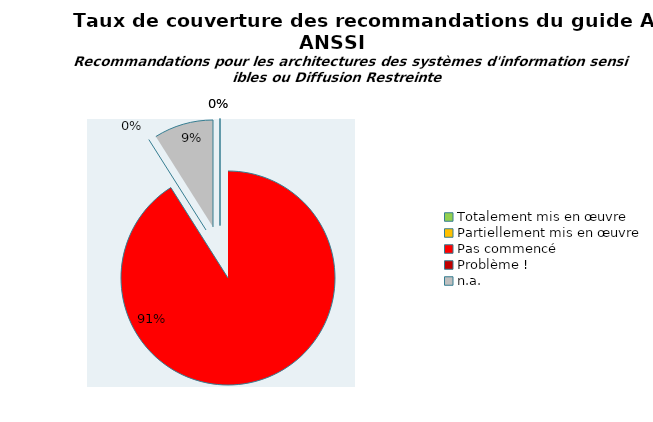
| Category | Series 0 |
|---|---|
| Totalement mis en œuvre | 0 |
| Partiellement mis en œuvre | 0 |
| Pas commencé | 71 |
| Problème ! | 0 |
| n.a. | 7 |